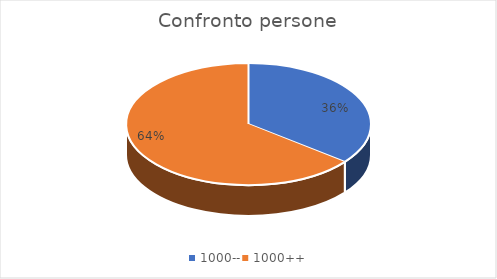
| Category | Series 0 |
|---|---|
| 1000-- | 512 |
| 1000++ | 926 |